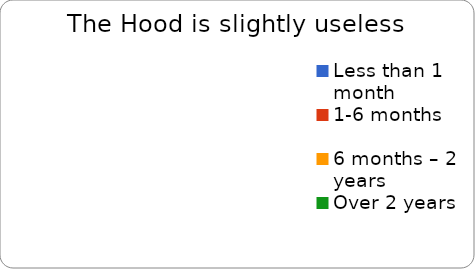
| Category | Slightly useless |
|---|---|
| Less than 1 month | 0 |
| 1-6 months | 0 |
| 6 months – 2 years | 0 |
| Over 2 years | 0 |